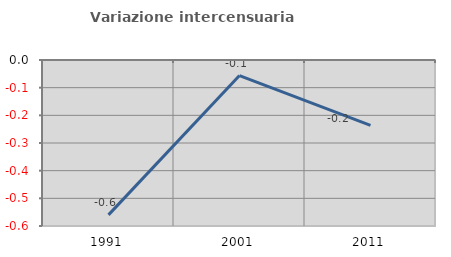
| Category | Variazione intercensuaria annua |
|---|---|
| 1991.0 | -0.56 |
| 2001.0 | -0.056 |
| 2011.0 | -0.236 |